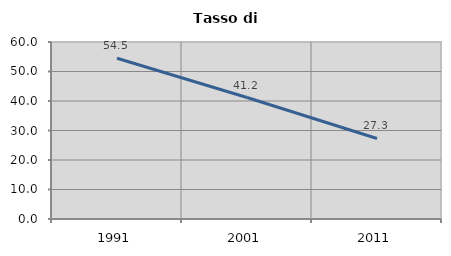
| Category | Tasso di disoccupazione   |
|---|---|
| 1991.0 | 54.475 |
| 2001.0 | 41.176 |
| 2011.0 | 27.295 |